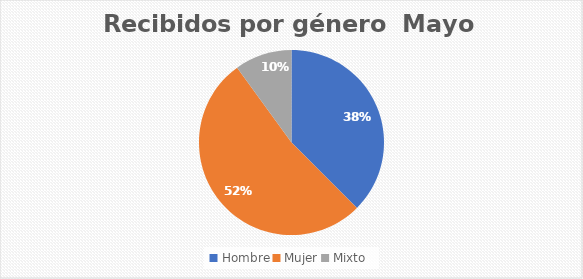
| Category | Recibidos por género  Mayo |
|---|---|
| Hombre | 15 |
| Mujer | 21 |
| Mixto | 4 |